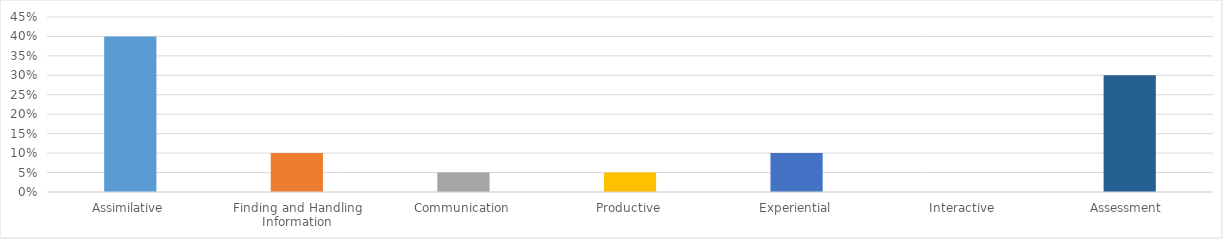
| Category | Series 0 |
|---|---|
| Assimilative | 0.4 |
| Finding and Handling Information | 0.1 |
| Communication | 0.05 |
| Productive | 0.05 |
| Experiential | 0.1 |
| Interactive | 0 |
| Assessment  | 0.3 |